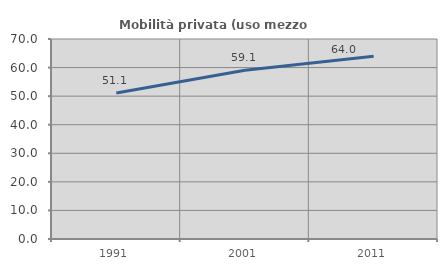
| Category | Mobilità privata (uso mezzo privato) |
|---|---|
| 1991.0 | 51.066 |
| 2001.0 | 59.054 |
| 2011.0 | 63.98 |